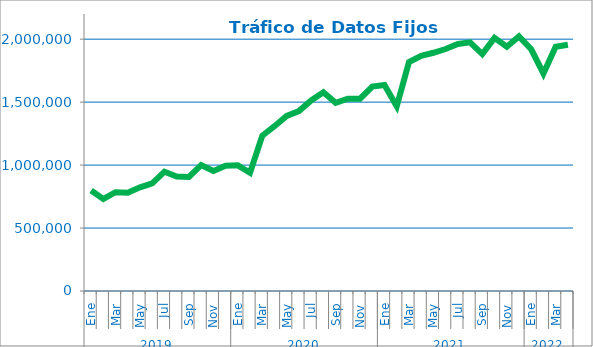
| Category | Series 2 |
|---|---|
| 0 | 798685.918 |
| 1 | 731575.817 |
| 2 | 784749.128 |
| 3 | 780968.133 |
| 4 | 823287.283 |
| 5 | 854090.708 |
| 6 | 947593.778 |
| 7 | 909855.298 |
| 8 | 906240.596 |
| 9 | 999396.547 |
| 10 | 952644.18 |
| 11 | 994702.802 |
| 12 | 998043.119 |
| 13 | 939529.747 |
| 14 | 1233422.945 |
| 15 | 1308700.517 |
| 16 | 1390818.383 |
| 17 | 1429389.058 |
| 18 | 1513898.129 |
| 19 | 1578469.308 |
| 20 | 1494651.805 |
| 21 | 1527689.762 |
| 22 | 1527595.376 |
| 23 | 1624013.076 |
| 24 | 1635978.542 |
| 25 | 1466373.79 |
| 26 | 1817279.963 |
| 27 | 1867095.32 |
| 28 | 1892209.579 |
| 29 | 1921759.576 |
| 30 | 1962438.137 |
| 31 | 1975182.781 |
| 32 | 1881672.102 |
| 33 | 2010730.589 |
| 34 | 1940295.941 |
| 35 | 2022499.807 |
| 36 | 1919833.376 |
| 37 | 1727728.602 |
| 38 | 1940004.078 |
| 39 | 1956419.243 |